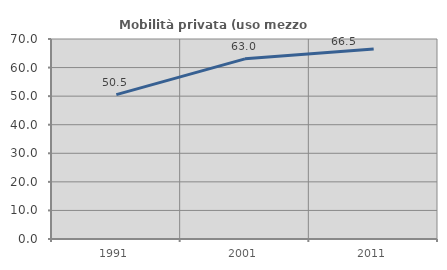
| Category | Mobilità privata (uso mezzo privato) |
|---|---|
| 1991.0 | 50.526 |
| 2001.0 | 63.046 |
| 2011.0 | 66.541 |